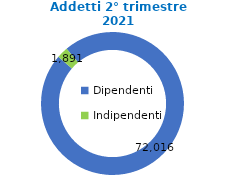
| Category | da 10 a 49 addetti |
|---|---|
| Dipendenti | 72016 |
| Indipendenti | 1891 |